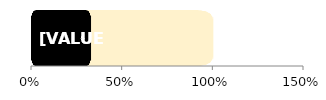
| Category | total | Women |
|---|---|---|
| 0 | 1 | 0.326 |